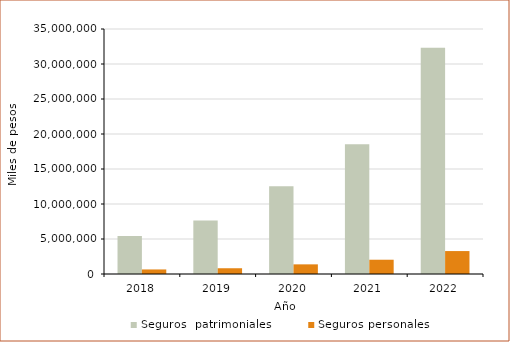
| Category | Seguros  | Seguros |
|---|---|---|
| 2018.0 | 5415095 | 650376 |
| 2019.0 | 7644000 | 822000 |
| 2020.0 | 12523000 | 1378000 |
| 2021.0 | 18532077.125 | 2038880.796 |
| 2022.0 | 32332180.117 | 3276619.637 |